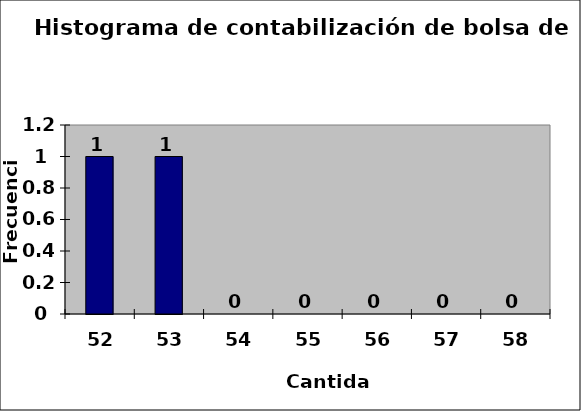
| Category | Frequency |
|---|---|
| 52.0 | 1 |
| 53.0 | 1 |
| 54.0 | 0 |
| 55.0 | 0 |
| 56.0 | 0 |
| 57.0 | 0 |
| 58.0 | 0 |